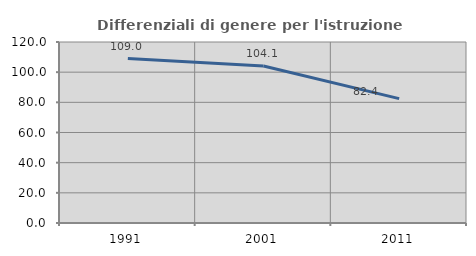
| Category | Differenziali di genere per l'istruzione superiore |
|---|---|
| 1991.0 | 108.981 |
| 2001.0 | 104.138 |
| 2011.0 | 82.432 |